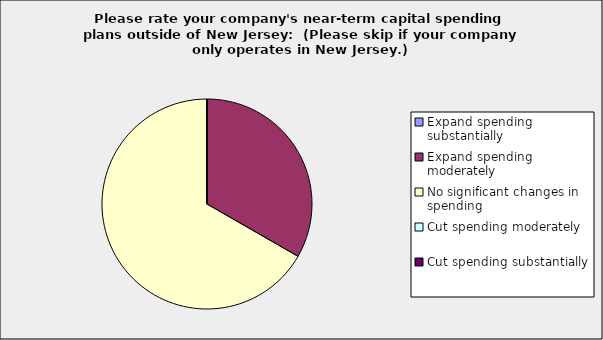
| Category | Series 0 |
|---|---|
| Expand spending substantially | 0 |
| Expand spending moderately | 0.333 |
| No significant changes in spending | 0.667 |
| Cut spending moderately | 0 |
| Cut spending substantially | 0 |